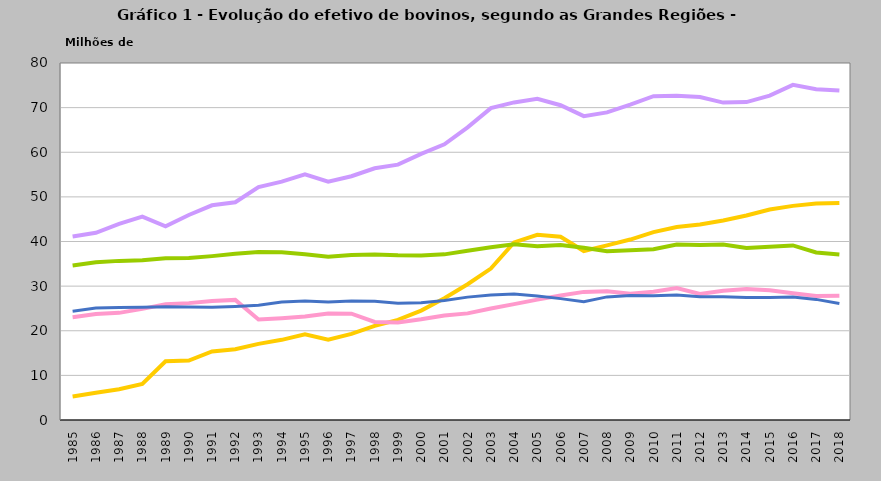
| Category | Centro-Oeste | Norte | Sudeste | Nordeste | Sul |
|---|---|---|---|---|---|
| 1985.0 | 41126487 | 5273372 | 34620663 | 23014947 | 24387197 |
| 1986.0 | 41939082 | 6095288 | 35367710 | 23736271 | 25083217 |
| 1987.0 | 43962391 | 6899166 | 35657970 | 24008252 | 25198501 |
| 1988.0 | 45576122 | 8061047 | 35802516 | 24897021 | 25262400 |
| 1989.0 | 43408874 | 13148461 | 36235614 | 25955266 | 25405888 |
| 1990.0 | 45945934 | 13316950 | 36323168 | 26190283 | 25325979 |
| 1991.0 | 48109039 | 15361795 | 36723631 | 26668890 | 25272150 |
| 1992.0 | 48788007 | 15846530 | 37231470 | 26911981 | 25451315 |
| 1993.0 | 52186481 | 17066794 | 37626538 | 22527240 | 25727020 |
| 1994.0 | 53419853 | 17966117 | 37604020 | 22824686 | 26428553 |
| 1995.0 | 55061299 | 19183092 | 37168199 | 23173936 | 26641412 |
| 1996.0 | 53398488 | 17982582 | 36604615 | 23882203 | 26420652 |
| 1997.0 | 54626557 | 19297809 | 36977462 | 23830908 | 26683421 |
| 1998.0 | 56401545 | 21098665 | 37073604 | 21980699 | 26599844 |
| 1999.0 | 57226833 | 22430811 | 36898631 | 21875110 | 26189653 |
| 2000.0 | 59641301 | 24517612 | 36851997 | 22566644 | 26297970 |
| 2001.0 | 61787299 | 27284210 | 37118765 | 23414017 | 26784435 |
| 2002.0 | 65567223 | 30428813 | 37923575 | 23892180 | 27537047 |
| 2003.0 | 69888635 | 33929590 | 38711076 | 24992158 | 28030117 |
| 2004.0 | 71168853 | 39787138 | 39379011 | 25966460 | 28211275 |
| 2005.0 | 71984504 | 41489002 | 38943898 | 26969286 | 27770006 |
| 2006.0 | 70535922 | 41060384 | 39208512 | 27881219 | 27200207 |
| 2007.0 | 68088112 | 37865772 | 38586629 | 28711240 | 26500261 |
| 2008.0 | 68929795 | 39119455 | 37820094 | 28851880 | 27585507 |
| 2009.0 | 70659695 | 40437159 | 38016674 | 28289850 | 27904576 |
| 2010.0 | 72559996 | 42100695 | 38251950 | 28762119 | 27866349 |
| 2011.0 | 72662219 | 43238310 | 39335644 | 29585933 | 27993205 |
| 2012.0 | 72385029 | 43815346 | 39206257 | 28244899 | 27627551 |
| 2013.0 | 71124329 | 44705617 | 39341429 | 28958676 | 27634241 |
| 2014.0 | 71234141 | 45826142 | 38530737 | 29350651 | 27424461 |
| 2015.0 | 72705736 | 47175989 | 38812076 | 29092184 | 27434523 |
| 2016.0 | 75112421 | 47983190 | 39123700 | 28393671 | 27577786 |
| 2017.0 | 74128217 | 48508063 | 37550079 | 27791097 | 27026122 |
| 2018.0 | 73838407 | 48614446 | 37111436 | 27836012 | 26122755 |